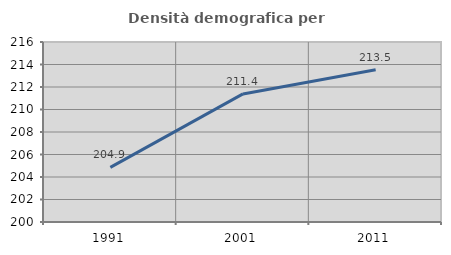
| Category | Densità demografica |
|---|---|
| 1991.0 | 204.857 |
| 2001.0 | 211.385 |
| 2011.0 | 213.54 |